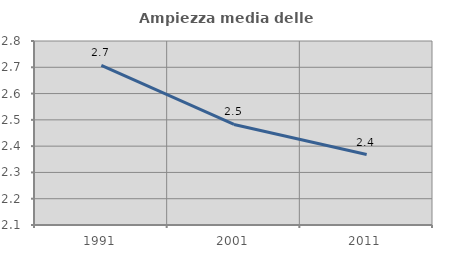
| Category | Ampiezza media delle famiglie |
|---|---|
| 1991.0 | 2.707 |
| 2001.0 | 2.482 |
| 2011.0 | 2.368 |